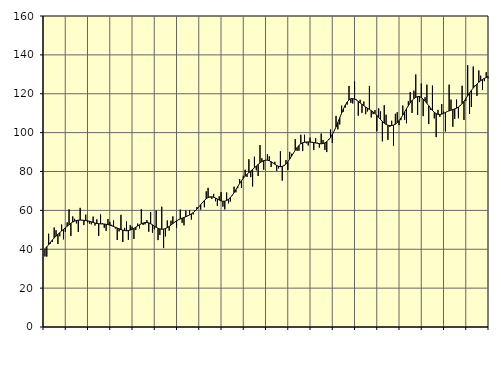
| Category | Piggar | Series 1 |
|---|---|---|
| nan | 36.3 | 40.28 |
| 1.0 | 36.2 | 41.29 |
| 1.0 | 48 | 42.33 |
| 1.0 | 42.9 | 43.66 |
| 1.0 | 43.7 | 44.78 |
| 1.0 | 51.2 | 45.82 |
| 1.0 | 49.8 | 46.76 |
| 1.0 | 42.7 | 47.65 |
| 1.0 | 46.7 | 48.56 |
| 1.0 | 52.7 | 49.39 |
| 1.0 | 45.1 | 50.2 |
| 1.0 | 49 | 51 |
| nan | 53.8 | 51.81 |
| 2.0 | 60.5 | 52.62 |
| 2.0 | 46.8 | 53.38 |
| 2.0 | 56.9 | 54 |
| 2.0 | 55.7 | 54.48 |
| 2.0 | 53.3 | 54.79 |
| 2.0 | 48.9 | 54.96 |
| 2.0 | 61.3 | 55.01 |
| 2.0 | 54.9 | 54.98 |
| 2.0 | 52.5 | 54.89 |
| 2.0 | 57.8 | 54.77 |
| 2.0 | 53.8 | 54.63 |
| nan | 53.2 | 54.41 |
| 3.0 | 52.8 | 54.12 |
| 3.0 | 56.8 | 53.79 |
| 3.0 | 52.2 | 53.48 |
| 3.0 | 55.4 | 53.25 |
| 3.0 | 46.8 | 53.12 |
| 3.0 | 57.9 | 53.05 |
| 3.0 | 53.4 | 53.02 |
| 3.0 | 51 | 52.96 |
| 3.0 | 49.5 | 52.84 |
| 3.0 | 55.6 | 52.67 |
| 3.0 | 54.1 | 52.41 |
| nan | 52.6 | 52.07 |
| 4.0 | 54.8 | 51.7 |
| 4.0 | 50.6 | 51.31 |
| 4.0 | 44.8 | 50.91 |
| 4.0 | 49.2 | 50.52 |
| 4.0 | 57.7 | 50.15 |
| 4.0 | 43.7 | 49.84 |
| 4.0 | 51 | 49.6 |
| 4.0 | 54.3 | 49.51 |
| 4.0 | 44.9 | 49.61 |
| 4.0 | 52.4 | 49.87 |
| 4.0 | 51.6 | 50.26 |
| nan | 45.3 | 50.78 |
| 5.0 | 49.9 | 51.34 |
| 5.0 | 53.2 | 51.94 |
| 5.0 | 50.7 | 52.58 |
| 5.0 | 60.6 | 53.12 |
| 5.0 | 52.5 | 53.51 |
| 5.0 | 52.8 | 53.74 |
| 5.0 | 55 | 53.77 |
| 5.0 | 49 | 53.57 |
| 5.0 | 59.1 | 53.15 |
| 5.0 | 48.5 | 52.57 |
| 5.0 | 50.2 | 51.89 |
| nan | 59.9 | 51.26 |
| 6.0 | 44.7 | 50.78 |
| 6.0 | 47.3 | 50.45 |
| 6.0 | 61.9 | 50.3 |
| 6.0 | 40.6 | 50.38 |
| 6.0 | 46.6 | 50.66 |
| 6.0 | 54.8 | 51.13 |
| 6.0 | 49.6 | 51.75 |
| 6.0 | 54.7 | 52.46 |
| 6.0 | 56.9 | 53.22 |
| 6.0 | 53.8 | 53.95 |
| 6.0 | 51.1 | 54.61 |
| nan | 55.3 | 55.16 |
| 7.0 | 60.4 | 55.6 |
| 7.0 | 53.6 | 56 |
| 7.0 | 52.3 | 56.38 |
| 7.0 | 59.9 | 56.74 |
| 7.0 | 57.3 | 57.17 |
| 7.0 | 60.2 | 57.65 |
| 7.0 | 55.3 | 58.21 |
| 7.0 | 57.9 | 58.89 |
| 7.0 | 60.2 | 59.71 |
| 7.0 | 61.7 | 60.69 |
| 7.0 | 61.8 | 61.8 |
| nan | 60.4 | 62.96 |
| 8.0 | 63.8 | 64.08 |
| 8.0 | 61.6 | 65.11 |
| 8.0 | 69.8 | 65.98 |
| 8.0 | 71.6 | 66.61 |
| 8.0 | 66.6 | 66.95 |
| 8.0 | 65.9 | 67 |
| 8.0 | 68.5 | 66.78 |
| 8.0 | 64.7 | 66.37 |
| 8.0 | 62.3 | 65.84 |
| 8.0 | 67.2 | 65.3 |
| 8.0 | 69.4 | 64.87 |
| nan | 61.9 | 64.67 |
| 9.0 | 60.5 | 64.73 |
| 9.0 | 69.2 | 65.09 |
| 9.0 | 63.6 | 65.71 |
| 9.0 | 64.5 | 66.57 |
| 9.0 | 67.5 | 67.72 |
| 9.0 | 72.2 | 69.11 |
| 9.0 | 69.3 | 70.64 |
| 9.0 | 71.4 | 72.27 |
| 9.0 | 76.1 | 73.84 |
| 9.0 | 71.5 | 75.26 |
| 9.0 | 77.8 | 76.51 |
| nan | 80.9 | 77.59 |
| 10.0 | 77.2 | 78.57 |
| 10.0 | 86.3 | 79.43 |
| 10.0 | 77.1 | 80.25 |
| 10.0 | 72.3 | 81.08 |
| 10.0 | 87.6 | 81.93 |
| 10.0 | 80.6 | 82.8 |
| 10.0 | 77.7 | 83.66 |
| 10.0 | 93.6 | 84.44 |
| 10.0 | 86.8 | 85.11 |
| 10.0 | 80.9 | 85.59 |
| 10.0 | 85.8 | 85.84 |
| nan | 88.9 | 85.82 |
| 11.0 | 87.8 | 85.53 |
| 11.0 | 82.3 | 85.03 |
| 11.0 | 84.3 | 84.39 |
| 11.0 | 85 | 83.72 |
| 11.0 | 80.3 | 83.12 |
| 11.0 | 81.6 | 82.68 |
| 11.0 | 90.4 | 82.49 |
| 11.0 | 75.3 | 82.63 |
| 11.0 | 83.4 | 83.07 |
| 11.0 | 85.9 | 83.88 |
| 11.0 | 80.8 | 85.02 |
| nan | 90.1 | 86.38 |
| 12.0 | 89.1 | 87.87 |
| 12.0 | 89.5 | 89.42 |
| 12.0 | 96.7 | 90.93 |
| 12.0 | 90.6 | 92.28 |
| 12.0 | 90.7 | 93.41 |
| 12.0 | 98.9 | 94.26 |
| 12.0 | 90.5 | 94.78 |
| 12.0 | 98.9 | 95.05 |
| 12.0 | 94.5 | 95.19 |
| 12.0 | 93.4 | 95.22 |
| 12.0 | 97.4 | 95.16 |
| nan | 94.9 | 95.06 |
| 13.0 | 91.1 | 94.91 |
| 13.0 | 97.1 | 94.7 |
| 13.0 | 94.8 | 94.48 |
| 13.0 | 92.3 | 94.31 |
| 13.0 | 99.5 | 94.26 |
| 13.0 | 96.2 | 94.39 |
| 13.0 | 91.1 | 94.72 |
| 13.0 | 90 | 95.35 |
| 13.0 | 96.7 | 96.25 |
| 13.0 | 101.6 | 97.47 |
| 13.0 | 94.7 | 99.03 |
| nan | 100.9 | 100.87 |
| 14.0 | 108.6 | 102.96 |
| 14.0 | 101.7 | 105.26 |
| 14.0 | 104.2 | 107.64 |
| 14.0 | 113.9 | 110.02 |
| 14.0 | 110.8 | 112.23 |
| 14.0 | 112.9 | 114.15 |
| 14.0 | 114.4 | 115.72 |
| 14.0 | 124 | 116.82 |
| 14.0 | 115.3 | 117.42 |
| 14.0 | 115 | 117.54 |
| 14.0 | 126.3 | 117.27 |
| nan | 117 | 116.76 |
| 15.0 | 108.7 | 116.07 |
| 15.0 | 116.9 | 115.28 |
| 15.0 | 110.2 | 114.55 |
| 15.0 | 116 | 113.85 |
| 15.0 | 109.5 | 113.16 |
| 15.0 | 110.9 | 112.54 |
| 15.0 | 124 | 111.94 |
| 15.0 | 107.8 | 111.3 |
| 15.0 | 109.5 | 110.61 |
| 15.0 | 111.6 | 109.84 |
| 15.0 | 100.7 | 108.9 |
| nan | 112.5 | 107.83 |
| 16.0 | 110.9 | 106.76 |
| 16.0 | 95.5 | 105.75 |
| 16.0 | 114.1 | 104.86 |
| 16.0 | 109.2 | 104.21 |
| 16.0 | 96.3 | 103.8 |
| 16.0 | 102.9 | 103.61 |
| 16.0 | 106.1 | 103.63 |
| 16.0 | 93.3 | 103.87 |
| 16.0 | 109.7 | 104.33 |
| 16.0 | 110.5 | 105.08 |
| 16.0 | 103.9 | 106.15 |
| nan | 106.4 | 107.47 |
| 17.0 | 113.9 | 108.99 |
| 17.0 | 106.6 | 110.65 |
| 17.0 | 104.8 | 112.3 |
| 17.0 | 116.2 | 113.85 |
| 17.0 | 120.9 | 115.3 |
| 17.0 | 110.1 | 116.54 |
| 17.0 | 121.6 | 117.49 |
| 17.0 | 129.9 | 118.18 |
| 17.0 | 109.1 | 118.56 |
| 17.0 | 115.7 | 118.53 |
| 17.0 | 125.2 | 118.08 |
| nan | 108.5 | 117.28 |
| 18.0 | 118.2 | 116.25 |
| 18.0 | 124.7 | 115.09 |
| 18.0 | 104.4 | 113.85 |
| 18.0 | 111.6 | 112.58 |
| 18.0 | 124.2 | 111.39 |
| 18.0 | 107.3 | 110.44 |
| 18.0 | 97.7 | 109.77 |
| 18.0 | 111.7 | 109.41 |
| 18.0 | 108.1 | 109.34 |
| 18.0 | 114.7 | 109.53 |
| 18.0 | 110.9 | 109.91 |
| nan | 100.6 | 110.38 |
| 19.0 | 110.7 | 110.83 |
| 19.0 | 124.7 | 111.2 |
| 19.0 | 117 | 111.55 |
| 19.0 | 103 | 111.89 |
| 19.0 | 107 | 112.2 |
| 19.0 | 117 | 112.57 |
| 19.0 | 107.4 | 113.14 |
| 19.0 | 114.2 | 113.93 |
| 19.0 | 124.1 | 114.91 |
| 19.0 | 106.5 | 116.11 |
| 19.0 | 116.2 | 117.47 |
| nan | 134.7 | 118.93 |
| 20.0 | 109.6 | 120.42 |
| 20.0 | 113.2 | 121.76 |
| 20.0 | 134 | 122.92 |
| 20.0 | 124.4 | 124 |
| 20.0 | 118.9 | 125.01 |
| 20.0 | 132 | 125.91 |
| 20.0 | 129.3 | 126.69 |
| 20.0 | 121.9 | 127.36 |
| 20.0 | 126.5 | 127.9 |
| 20.0 | 131.1 | 128.35 |
| 20.0 | 128 | 128.78 |